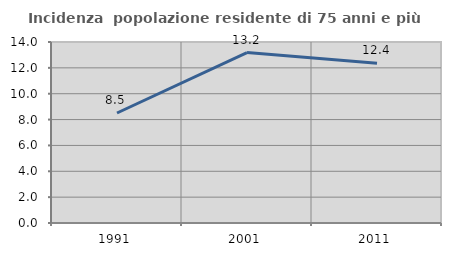
| Category | Incidenza  popolazione residente di 75 anni e più |
|---|---|
| 1991.0 | 8.507 |
| 2001.0 | 13.179 |
| 2011.0 | 12.36 |